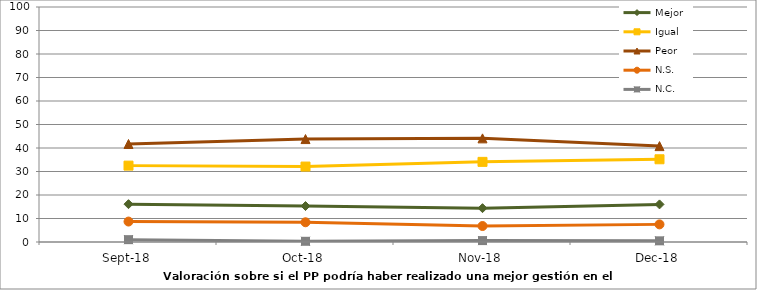
| Category | Mejor | Igual | Peor | N.S. | N.C. |
|---|---|---|---|---|---|
| 2018-09-01 | 16.1 | 32.5 | 41.7 | 8.7 | 1 |
| 2018-10-01 | 15.3 | 32.1 | 43.8 | 8.4 | 0.3 |
| 2018-11-01 | 14.4 | 34.1 | 44.1 | 6.8 | 0.6 |
| 2018-12-01 | 16 | 35.2 | 40.8 | 7.5 | 0.5 |